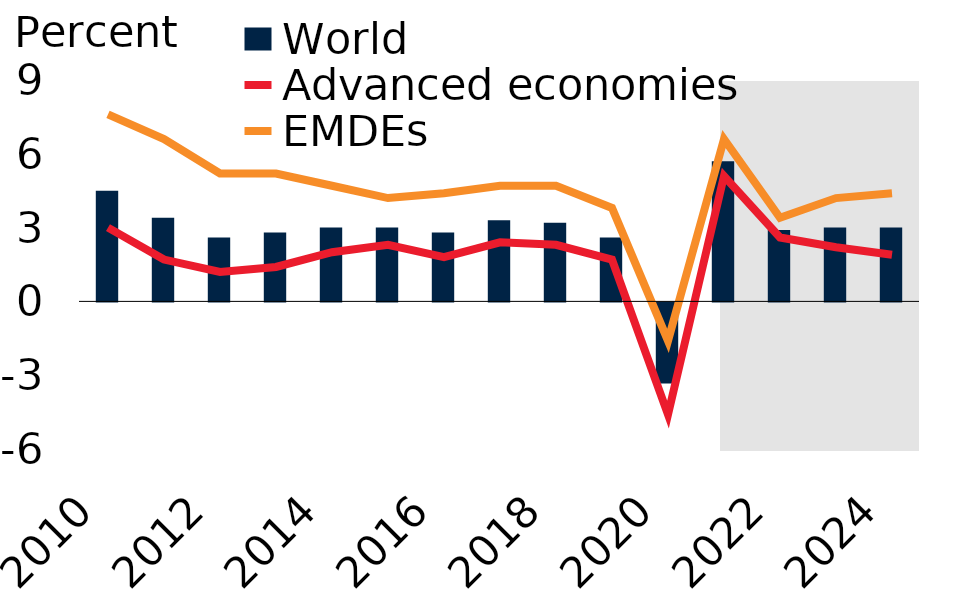
| Category | World |
|---|---|
| 2010.0 | 4.5 |
| 2011.0 | 3.4 |
| 2012.0 | 2.6 |
| 2013.0 | 2.8 |
| 2014.0 | 3 |
| 2015.0 | 3 |
| 2016.0 | 2.8 |
| 2017.0 | 3.3 |
| 2018.0 | 3.2 |
| 2019.0 | 2.6 |
| 2020.0 | -3.3 |
| 2021.0 | 5.7 |
| 2022.0 | 2.9 |
| 2023.0 | 3 |
| 2024.0 | 3 |